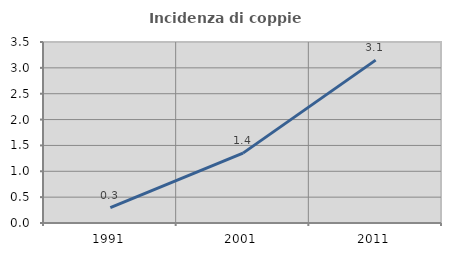
| Category | Incidenza di coppie miste |
|---|---|
| 1991.0 | 0.299 |
| 2001.0 | 1.351 |
| 2011.0 | 3.15 |